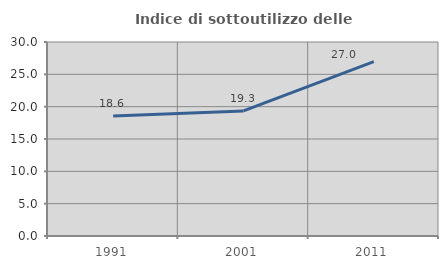
| Category | Indice di sottoutilizzo delle abitazioni  |
|---|---|
| 1991.0 | 18.561 |
| 2001.0 | 19.339 |
| 2011.0 | 26.955 |